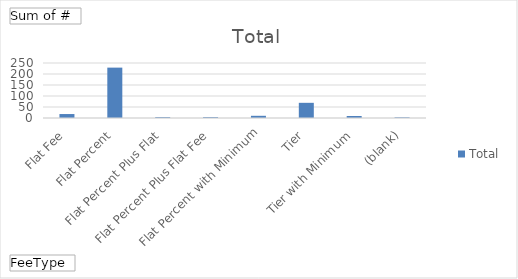
| Category | Total |
|---|---|
| Flat Fee | 18 |
| Flat Percent | 229 |
| Flat Percent Plus Flat | 4 |
| Flat Percent Plus Flat Fee | 4 |
| Flat Percent with Minimum | 10 |
| Tier | 69 |
| Tier with Minimum | 9 |
| (blank) | 3 |